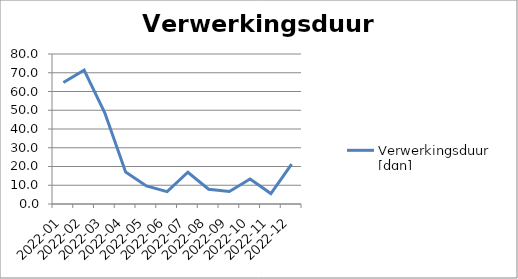
| Category | Verwerkingsduur [dgn] |
|---|---|
| 2022-01 | 64.78 |
| 2022-02 | 71.396 |
| 2022-03 | 48.513 |
| 2022-04 | 17.1 |
| 2022-05 | 9.63 |
| 2022-06 | 6.604 |
| 2022-07 | 16.928 |
| 2022-08 | 7.891 |
| 2022-09 | 6.693 |
| 2022-10 | 13.362 |
| 2022-11 | 5.579 |
| 2022-12 | 21.214 |